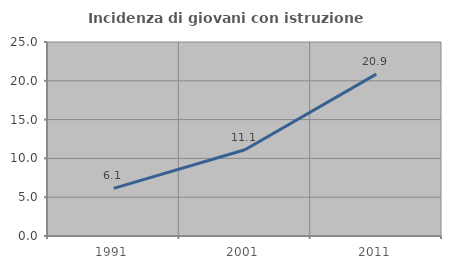
| Category | Incidenza di giovani con istruzione universitaria |
|---|---|
| 1991.0 | 6.132 |
| 2001.0 | 11.111 |
| 2011.0 | 20.859 |